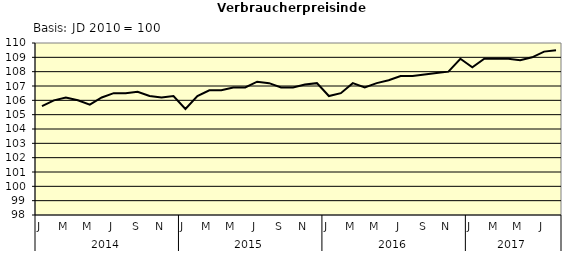
| Category | Series 0 |
|---|---|
| 0 | 105.6 |
| 1 | 106 |
| 2 | 106.2 |
| 3 | 106 |
| 4 | 105.7 |
| 5 | 106.2 |
| 6 | 106.5 |
| 7 | 106.5 |
| 8 | 106.6 |
| 9 | 106.3 |
| 10 | 106.2 |
| 11 | 106.3 |
| 12 | 105.4 |
| 13 | 106.3 |
| 14 | 106.7 |
| 15 | 106.7 |
| 16 | 106.9 |
| 17 | 106.9 |
| 18 | 107.3 |
| 19 | 107.2 |
| 20 | 106.9 |
| 21 | 106.9 |
| 22 | 107.1 |
| 23 | 107.2 |
| 24 | 106.3 |
| 25 | 106.5 |
| 26 | 107.2 |
| 27 | 106.9 |
| 28 | 107.2 |
| 29 | 107.4 |
| 30 | 107.7 |
| 31 | 107.7 |
| 32 | 107.8 |
| 33 | 107.9 |
| 34 | 108 |
| 35 | 108.9 |
| 36 | 108.3 |
| 37 | 108.9 |
| 38 | 108.9 |
| 39 | 108.9 |
| 40 | 108.8 |
| 41 | 109 |
| 42 | 109.4 |
| 43 | 109.5 |